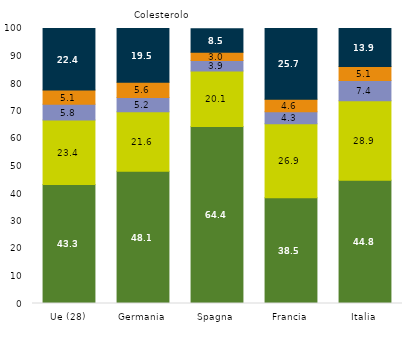
| Category | Meno di un anno | Da 1 a 3 anni | Da 3 a 5 anni | 5 anni e più | Mai |
|---|---|---|---|---|---|
| Ue (28) | 43.3 | 23.4 | 5.8 | 5.1 | 22.4 |
| Germania | 48.1 | 21.6 | 5.2 | 5.6 | 19.5 |
| Spagna | 64.4 | 20.1 | 3.9 | 3 | 8.5 |
| Francia | 38.5 | 26.9 | 4.3 | 4.6 | 25.7 |
| Italia | 44.8 | 28.9 | 7.4 | 5.1 | 13.9 |